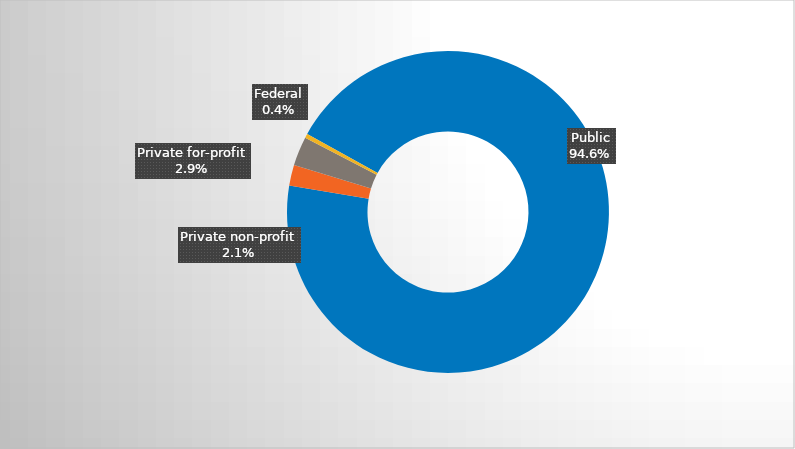
| Category | Series 0 |
|---|---|
| Public | 0.946 |
| Private non-profit | 0.021 |
| Private for-profit | 0.029 |
| Federal | 0.004 |